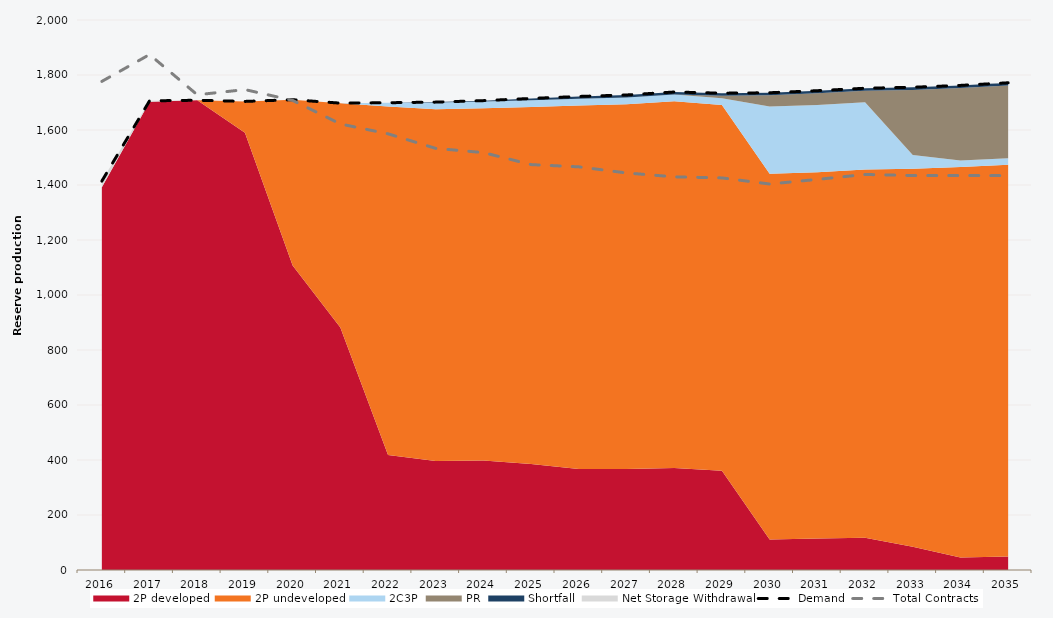
| Category | Demand | Total Contracts |
|---|---|---|
| 0 | 1414.202 | 1776.781 |
| 1 | 1706.077 | 1874.371 |
| 2 | 1708.134 | 1727.997 |
| 3 | 1703.937 | 1746.967 |
| 4 | 1710.181 | 1707.643 |
| 5 | 1697.64 | 1621.977 |
| 6 | 1699.158 | 1586.126 |
| 7 | 1701.381 | 1533.126 |
| 8 | 1706.814 | 1517.777 |
| 9 | 1714.75 | 1474.136 |
| 10 | 1721.984 | 1466.013 |
| 11 | 1727.389 | 1443.817 |
| 12 | 1738.186 | 1429.645 |
| 13 | 1733.853 | 1425.788 |
| 14 | 1735.46 | 1403.548 |
| 15 | 1742.934 | 1420.349 |
| 16 | 1751.871 | 1438.314 |
| 17 | 1755.42 | 1434.467 |
| 18 | 1762.185 | 1434.453 |
| 19 | 1771.73 | 1434.032 |